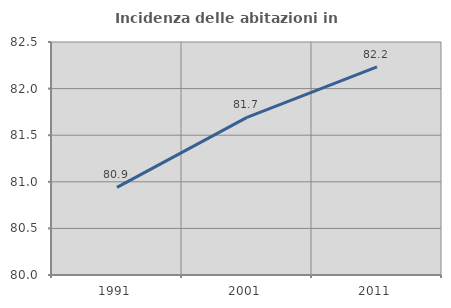
| Category | Incidenza delle abitazioni in proprietà  |
|---|---|
| 1991.0 | 80.94 |
| 2001.0 | 81.691 |
| 2011.0 | 82.234 |